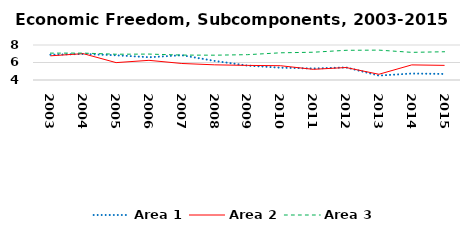
| Category | Area 1 | Area 2 | Area 3 |
|---|---|---|---|
| 2003.0 | 6.887 | 6.763 | 7.071 |
| 2004.0 | 6.976 | 7.01 | 7.075 |
| 2005.0 | 6.829 | 5.986 | 6.945 |
| 2006.0 | 6.601 | 6.247 | 6.963 |
| 2007.0 | 6.831 | 5.888 | 6.847 |
| 2008.0 | 6.181 | 5.733 | 6.837 |
| 2009.0 | 5.646 | 5.669 | 6.895 |
| 2010.0 | 5.406 | 5.633 | 7.107 |
| 2011.0 | 5.318 | 5.218 | 7.173 |
| 2012.0 | 5.435 | 5.425 | 7.394 |
| 2013.0 | 4.505 | 4.655 | 7.415 |
| 2014.0 | 4.74 | 5.727 | 7.159 |
| 2015.0 | 4.691 | 5.672 | 7.228 |